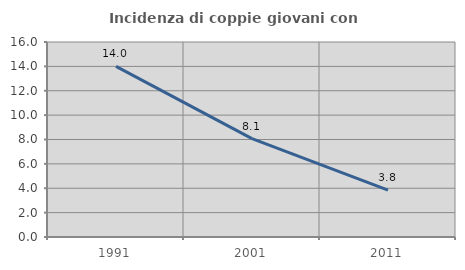
| Category | Incidenza di coppie giovani con figli |
|---|---|
| 1991.0 | 14.005 |
| 2001.0 | 8.073 |
| 2011.0 | 3.846 |